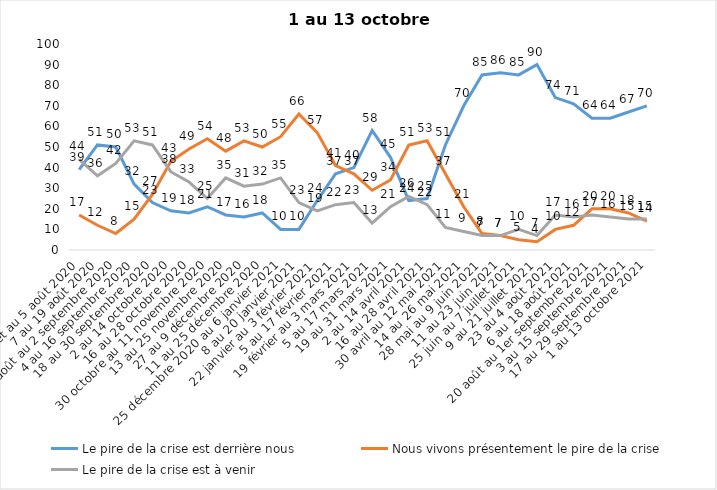
| Category | Le pire de la crise est derrière nous | Nous vivons présentement le pire de la crise | Le pire de la crise est à venir |
|---|---|---|---|
| 24 juillet au 5 août 2020 | 39 | 17 | 44 |
| 7 au 19 août 2020 | 51 | 12 | 36 |
| 21 août au 2 septembre 2020 | 50 | 8 | 42 |
| 4 au 16 septembre 2020 | 32 | 15 | 53 |
| 18 au 30 septembre 2020 | 23 | 27 | 51 |
| 2 au 14 octobre 2020 | 19 | 43 | 38 |
| 16 au 28 octobre 2020 | 18 | 49 | 33 |
| 30 octobre au 11 novembre 2020 | 21 | 54 | 25 |
| 13 au 25 novembre 2020 | 17 | 48 | 35 |
| 27 au 9 décembre 2020 | 16 | 53 | 31 |
| 11 au 25 décembre 2020 | 18 | 50 | 32 |
| 25 décembre 2020 au 6 janvier 2021 | 10 | 55 | 35 |
| 8 au 20 janvier 2021 | 10 | 66 | 23 |
| 22 janvier au 3 février 2021 | 24 | 57 | 19 |
| 5 au 17 février 2021 | 37 | 41 | 22 |
| 19 février au 3 mars 2021 | 40 | 37 | 23 |
| 5 au 17 mars 2021 | 58 | 29 | 13 |
| 19 au 31 mars 2021 | 45 | 34 | 21 |
| 2 au 14 avril 2021 | 24 | 51 | 26 |
| 16 au 28 avril 2021 | 25 | 53 | 22 |
| 30 avril au 12 mai 2021 | 51 | 37 | 11 |
| 14 au 26 mai 2021 | 70 | 21 | 9 |
| 28 mai au 9 juin 2021 | 85 | 8 | 7 |
| 11 au 23 juin 2021 | 86 | 7 | 7 |
| 25 juin au 7 juillet 2021 | 85 | 5 | 10 |
| 9 au 21 juillet 2021 | 90 | 4 | 7 |
| 23 au 4 août 2021 | 74 | 10 | 17 |
| 6 au 18 août 2021 | 71 | 12 | 16 |
| 20 août au 1er septembre 2021 | 64 | 20 | 17 |
| 3 au 15 septembre 2021 | 64 | 20 | 16 |
| 17 au 29 septembre 2021 | 67 | 18 | 15 |
| 1 au 13 octobre 2021 | 70 | 14 | 15 |